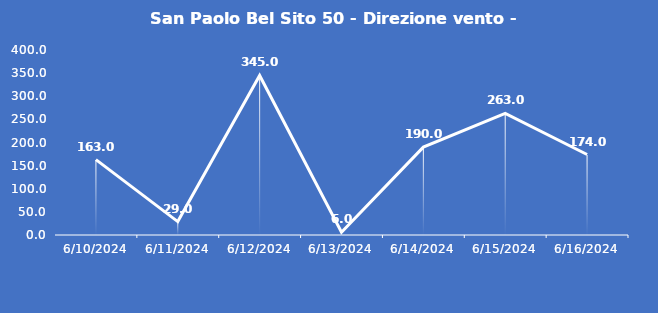
| Category | San Paolo Bel Sito 50 - Direzione vento - Grezzo (°N) |
|---|---|
| 6/10/24 | 163 |
| 6/11/24 | 29 |
| 6/12/24 | 345 |
| 6/13/24 | 6 |
| 6/14/24 | 190 |
| 6/15/24 | 263 |
| 6/16/24 | 174 |